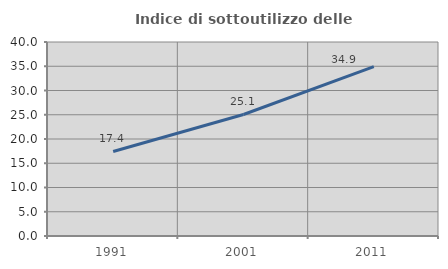
| Category | Indice di sottoutilizzo delle abitazioni  |
|---|---|
| 1991.0 | 17.436 |
| 2001.0 | 25.057 |
| 2011.0 | 34.94 |